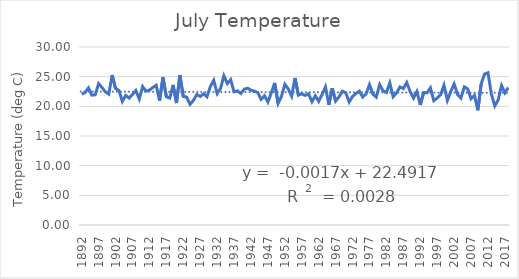
| Category | Series 0 |
|---|---|
| 1892.0 | 22.056 |
| 1893.0 | 22.333 |
| 1894.0 | 23.111 |
| 1895.0 | 21.889 |
| 1896.0 | 21.944 |
| 1897.0 | 23.833 |
| 1898.0 | 23.167 |
| 1899.0 | 22.444 |
| 1900.0 | 22.056 |
| 1901.0 | 25.278 |
| 1902.0 | 23 |
| 1903.0 | 22.667 |
| 1904.0 | 20.833 |
| 1905.0 | 21.833 |
| 1906.0 | 21.389 |
| 1907.0 | 22 |
| 1908.0 | 22.667 |
| 1909.0 | 21.222 |
| 1910.0 | 23.333 |
| 1911.0 | 22.556 |
| 1912.0 | 22.722 |
| 1913.0 | 23.167 |
| 1914.0 | 23.556 |
| 1915.0 | 20.944 |
| 1916.0 | 24.889 |
| 1917.0 | 21.611 |
| 1918.0 | 21.389 |
| 1919.0 | 23.611 |
| 1920.0 | 20.556 |
| 1921.0 | 25.278 |
| 1922.0 | 21.667 |
| 1923.0 | 21.556 |
| 1924.0 | 20.333 |
| 1925.0 | 21 |
| 1926.0 | 22 |
| 1927.0 | 21.667 |
| 1928.0 | 22.111 |
| 1929.0 | 21.611 |
| 1930.0 | 23.333 |
| 1931.0 | 24.389 |
| 1932.0 | 22.167 |
| 1933.0 | 23 |
| 1934.0 | 25.167 |
| 1935.0 | 23.833 |
| 1936.0 | 24.5 |
| 1937.0 | 22.444 |
| 1938.0 | 22.611 |
| 1939.0 | 22.167 |
| 1940.0 | 22.889 |
| 1941.0 | 23.056 |
| 1942.0 | 22.722 |
| 1943.0 | 22.556 |
| 1944.0 | 22.333 |
| 1945.0 | 21.167 |
| 1946.0 | 21.778 |
| 1947.0 | 20.722 |
| 1948.0 | 22.278 |
| 1949.0 | 23.944 |
| 1950.0 | 20.5 |
| 1951.0 | 21.667 |
| 1952.0 | 23.722 |
| 1953.0 | 22.944 |
| 1954.0 | 21.722 |
| 1955.0 | 24.778 |
| 1956.0 | 21.889 |
| 1957.0 | 22.111 |
| 1958.0 | 21.833 |
| 1959.0 | 22.111 |
| 1960.0 | 20.778 |
| 1961.0 | 21.778 |
| 1962.0 | 20.833 |
| 1963.0 | 22 |
| 1964.0 | 23.278 |
| 1965.0 | 20.278 |
| 1966.0 | 23.056 |
| 1967.0 | 20.889 |
| 1968.0 | 21.611 |
| 1969.0 | 22.556 |
| 1970.0 | 22.278 |
| 1971.0 | 20.722 |
| 1972.0 | 21.667 |
| 1973.0 | 22.167 |
| 1974.0 | 22.556 |
| 1975.0 | 21.556 |
| 1976.0 | 22.111 |
| 1977.0 | 23.667 |
| 1978.0 | 22.056 |
| 1979.0 | 21.556 |
| 1980.0 | 23.667 |
| 1981.0 | 22.611 |
| 1982.0 | 22.333 |
| 1983.0 | 23.944 |
| 1984.0 | 21.611 |
| 1985.0 | 22.278 |
| 1986.0 | 23.278 |
| 1987.0 | 23 |
| 1988.0 | 24 |
| 1989.0 | 22.5 |
| 1990.0 | 21.389 |
| 1991.0 | 22.5 |
| 1992.0 | 20.222 |
| 1993.0 | 22.333 |
| 1994.0 | 22.278 |
| 1995.0 | 23.111 |
| 1996.0 | 20.944 |
| 1997.0 | 21.389 |
| 1998.0 | 21.944 |
| 1999.0 | 23.556 |
| 2000.0 | 21 |
| 2001.0 | 22.5 |
| 2002.0 | 23.778 |
| 2003.0 | 22 |
| 2004.0 | 21.389 |
| 2005.0 | 23.278 |
| 2006.0 | 22.944 |
| 2007.0 | 21.278 |
| 2008.0 | 21.833 |
| 2009.0 | 19.333 |
| 2010.0 | 23.833 |
| 2011.0 | 25.444 |
| 2012.0 | 25.667 |
| 2013.0 | 22.056 |
| 2014.0 | 20.08 |
| 2015.0 | 21.056 |
| 2016.0 | 23.5 |
| 2017.0 | 22.278 |
| 2018.0 | 23.167 |